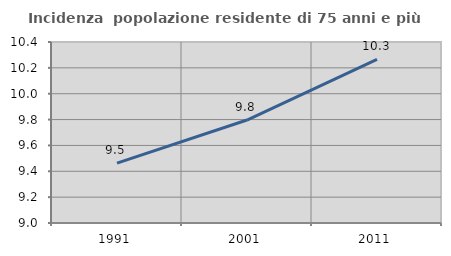
| Category | Incidenza  popolazione residente di 75 anni e più |
|---|---|
| 1991.0 | 9.463 |
| 2001.0 | 9.796 |
| 2011.0 | 10.266 |